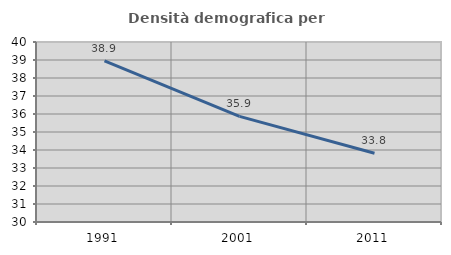
| Category | Densità demografica |
|---|---|
| 1991.0 | 38.946 |
| 2001.0 | 35.871 |
| 2011.0 | 33.821 |